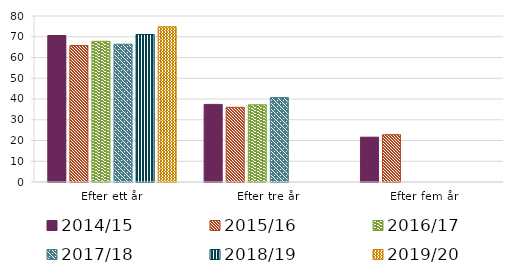
| Category | 2014/15 | 2015/16 | 2016/17 | 2017/18 | 2018/19 | 2019/20 |
|---|---|---|---|---|---|---|
| Efter ett år | 70.6 | 65.8 | 67.8 | 66.4 | 71.1 | 74.8 |
| Efter tre år | 37.4 | 36 | 37.2 | 40.7 | 0 | 0 |
| Efter fem år | 21.6 | 22.8 | 0 | 0 | 0 | 0 |